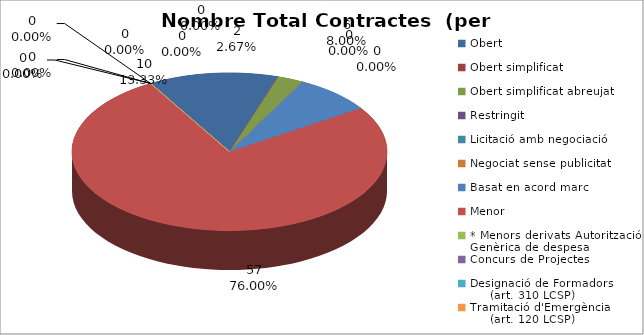
| Category | Nombre Total Contractes |
|---|---|
| Obert | 10 |
| Obert simplificat | 0 |
| Obert simplificat abreujat | 2 |
| Restringit | 0 |
| Licitació amb negociació | 0 |
| Negociat sense publicitat | 0 |
| Basat en acord marc | 6 |
| Menor | 57 |
| * Menors derivats Autorització Genèrica de despesa | 0 |
| Concurs de Projectes | 0 |
| Designació de Formadors
     (art. 310 LCSP) | 0 |
| Tramitació d'Emergència
     (art. 120 LCSP) | 0 |